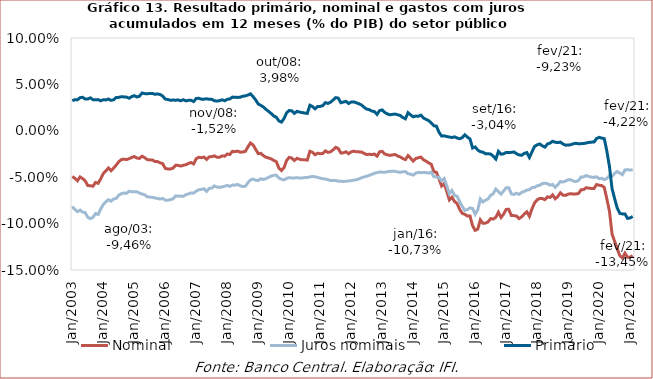
| Category | Nominal | Juros nominais | Primário |
|---|---|---|---|
| 2003-01-01 | -0.049 | -0.082 | 0.032 |
| 2003-02-01 | -0.051 | -0.085 | 0.034 |
| 2003-03-01 | -0.054 | -0.087 | 0.033 |
| 2003-04-01 | -0.05 | -0.085 | 0.036 |
| 2003-05-01 | -0.051 | -0.088 | 0.036 |
| 2003-06-01 | -0.054 | -0.088 | 0.034 |
| 2003-07-01 | -0.059 | -0.093 | 0.034 |
| 2003-08-01 | -0.059 | -0.095 | 0.036 |
| 2003-09-01 | -0.06 | -0.093 | 0.034 |
| 2003-10-01 | -0.056 | -0.089 | 0.033 |
| 2003-11-01 | -0.057 | -0.09 | 0.034 |
| 2003-12-01 | -0.052 | -0.084 | 0.032 |
| 2004-01-01 | -0.046 | -0.079 | 0.033 |
| 2004-02-01 | -0.043 | -0.076 | 0.033 |
| 2004-03-01 | -0.04 | -0.074 | 0.034 |
| 2004-04-01 | -0.043 | -0.076 | 0.033 |
| 2004-05-01 | -0.04 | -0.073 | 0.033 |
| 2004-06-01 | -0.037 | -0.073 | 0.036 |
| 2004-07-01 | -0.033 | -0.069 | 0.036 |
| 2004-08-01 | -0.031 | -0.068 | 0.037 |
| 2004-09-01 | -0.031 | -0.067 | 0.036 |
| 2004-10-01 | -0.031 | -0.067 | 0.036 |
| 2004-11-01 | -0.03 | -0.065 | 0.035 |
| 2004-12-01 | -0.029 | -0.066 | 0.037 |
| 2005-01-01 | -0.028 | -0.066 | 0.038 |
| 2005-02-01 | -0.029 | -0.066 | 0.036 |
| 2005-03-01 | -0.03 | -0.067 | 0.037 |
| 2005-04-01 | -0.027 | -0.068 | 0.041 |
| 2005-05-01 | -0.029 | -0.069 | 0.04 |
| 2005-06-01 | -0.031 | -0.071 | 0.04 |
| 2005-07-01 | -0.031 | -0.072 | 0.04 |
| 2005-08-01 | -0.031 | -0.072 | 0.04 |
| 2005-09-01 | -0.033 | -0.072 | 0.039 |
| 2005-10-01 | -0.033 | -0.073 | 0.04 |
| 2005-11-01 | -0.034 | -0.074 | 0.039 |
| 2005-12-01 | -0.035 | -0.073 | 0.037 |
| 2006-01-01 | -0.041 | -0.075 | 0.034 |
| 2006-02-01 | -0.041 | -0.075 | 0.034 |
| 2006-03-01 | -0.041 | -0.074 | 0.033 |
| 2006-04-01 | -0.04 | -0.073 | 0.033 |
| 2006-05-01 | -0.037 | -0.07 | 0.033 |
| 2006-06-01 | -0.037 | -0.07 | 0.033 |
| 2006-07-01 | -0.038 | -0.07 | 0.032 |
| 2006-08-01 | -0.037 | -0.071 | 0.034 |
| 2006-09-01 | -0.037 | -0.069 | 0.032 |
| 2006-10-01 | -0.035 | -0.068 | 0.033 |
| 2006-11-01 | -0.034 | -0.067 | 0.033 |
| 2006-12-01 | -0.036 | -0.067 | 0.032 |
| 2007-01-01 | -0.03 | -0.065 | 0.035 |
| 2007-02-01 | -0.028 | -0.063 | 0.035 |
| 2007-03-01 | -0.029 | -0.063 | 0.034 |
| 2007-04-01 | -0.028 | -0.062 | 0.034 |
| 2007-05-01 | -0.031 | -0.065 | 0.035 |
| 2007-06-01 | -0.028 | -0.062 | 0.034 |
| 2007-07-01 | -0.028 | -0.062 | 0.034 |
| 2007-08-01 | -0.027 | -0.059 | 0.032 |
| 2007-09-01 | -0.028 | -0.061 | 0.032 |
| 2007-10-01 | -0.029 | -0.061 | 0.032 |
| 2007-11-01 | -0.027 | -0.06 | 0.033 |
| 2007-12-01 | -0.027 | -0.06 | 0.032 |
| 2008-01-01 | -0.025 | -0.059 | 0.034 |
| 2008-02-01 | -0.026 | -0.06 | 0.034 |
| 2008-03-01 | -0.022 | -0.058 | 0.036 |
| 2008-04-01 | -0.022 | -0.059 | 0.036 |
| 2008-05-01 | -0.022 | -0.058 | 0.036 |
| 2008-06-01 | -0.023 | -0.059 | 0.036 |
| 2008-07-01 | -0.023 | -0.06 | 0.037 |
| 2008-08-01 | -0.022 | -0.06 | 0.038 |
| 2008-09-01 | -0.017 | -0.056 | 0.039 |
| 2008-10-01 | -0.013 | -0.053 | 0.04 |
| 2008-11-01 | -0.015 | -0.052 | 0.037 |
| 2008-12-01 | -0.02 | -0.053 | 0.033 |
| 2009-01-01 | -0.025 | -0.054 | 0.029 |
| 2009-02-01 | -0.024 | -0.052 | 0.027 |
| 2009-03-01 | -0.027 | -0.052 | 0.026 |
| 2009-04-01 | -0.029 | -0.052 | 0.023 |
| 2009-05-01 | -0.029 | -0.05 | 0.021 |
| 2009-06-01 | -0.03 | -0.049 | 0.019 |
| 2009-07-01 | -0.032 | -0.048 | 0.016 |
| 2009-08-01 | -0.033 | -0.048 | 0.015 |
| 2009-09-01 | -0.04 | -0.051 | 0.011 |
| 2009-10-01 | -0.043 | -0.052 | 0.009 |
| 2009-11-01 | -0.04 | -0.053 | 0.013 |
| 2009-12-01 | -0.032 | -0.051 | 0.019 |
| 2010-01-01 | -0.029 | -0.05 | 0.022 |
| 2010-02-01 | -0.029 | -0.051 | 0.022 |
| 2010-03-01 | -0.032 | -0.051 | 0.019 |
| 2010-04-01 | -0.03 | -0.051 | 0.021 |
| 2010-05-01 | -0.031 | -0.051 | 0.02 |
| 2010-06-01 | -0.031 | -0.051 | 0.02 |
| 2010-07-01 | -0.031 | -0.05 | 0.019 |
| 2010-08-01 | -0.032 | -0.05 | 0.019 |
| 2010-09-01 | -0.022 | -0.05 | 0.028 |
| 2010-10-01 | -0.023 | -0.049 | 0.026 |
| 2010-11-01 | -0.026 | -0.049 | 0.024 |
| 2010-12-01 | -0.024 | -0.05 | 0.026 |
| 2011-01-01 | -0.025 | -0.051 | 0.026 |
| 2011-02-01 | -0.024 | -0.052 | 0.027 |
| 2011-03-01 | -0.022 | -0.052 | 0.03 |
| 2011-04-01 | -0.023 | -0.053 | 0.029 |
| 2011-05-01 | -0.023 | -0.053 | 0.031 |
| 2011-06-01 | -0.02 | -0.054 | 0.033 |
| 2011-07-01 | -0.018 | -0.054 | 0.036 |
| 2011-08-01 | -0.019 | -0.054 | 0.035 |
| 2011-09-01 | -0.024 | -0.054 | 0.03 |
| 2011-10-01 | -0.024 | -0.055 | 0.031 |
| 2011-11-01 | -0.023 | -0.054 | 0.032 |
| 2011-12-01 | -0.025 | -0.054 | 0.029 |
| 2012-01-01 | -0.023 | -0.054 | 0.031 |
| 2012-02-01 | -0.022 | -0.053 | 0.031 |
| 2012-03-01 | -0.023 | -0.053 | 0.03 |
| 2012-04-01 | -0.023 | -0.052 | 0.029 |
| 2012-05-01 | -0.023 | -0.051 | 0.028 |
| 2012-06-01 | -0.024 | -0.05 | 0.025 |
| 2012-07-01 | -0.026 | -0.049 | 0.023 |
| 2012-08-01 | -0.025 | -0.048 | 0.023 |
| 2012-09-01 | -0.026 | -0.047 | 0.021 |
| 2012-10-01 | -0.025 | -0.046 | 0.021 |
| 2012-11-01 | -0.027 | -0.045 | 0.018 |
| 2012-12-01 | -0.023 | -0.044 | 0.022 |
| 2013-01-01 | -0.022 | -0.045 | 0.022 |
| 2013-02-01 | -0.025 | -0.045 | 0.02 |
| 2013-03-01 | -0.026 | -0.044 | 0.018 |
| 2013-04-01 | -0.027 | -0.044 | 0.017 |
| 2013-05-01 | -0.026 | -0.044 | 0.018 |
| 2013-06-01 | -0.026 | -0.044 | 0.018 |
| 2013-07-01 | -0.027 | -0.044 | 0.017 |
| 2013-08-01 | -0.028 | -0.045 | 0.016 |
| 2013-09-01 | -0.03 | -0.044 | 0.014 |
| 2013-10-01 | -0.031 | -0.044 | 0.013 |
| 2013-11-01 | -0.027 | -0.046 | 0.02 |
| 2013-12-01 | -0.03 | -0.047 | 0.017 |
| 2014-01-01 | -0.033 | -0.048 | 0.015 |
| 2014-02-01 | -0.03 | -0.046 | 0.016 |
| 2014-03-01 | -0.029 | -0.045 | 0.016 |
| 2014-04-01 | -0.028 | -0.045 | 0.017 |
| 2014-05-01 | -0.031 | -0.045 | 0.014 |
| 2014-06-01 | -0.033 | -0.045 | 0.012 |
| 2014-07-01 | -0.035 | -0.046 | 0.011 |
| 2014-08-01 | -0.036 | -0.044 | 0.008 |
| 2014-09-01 | -0.044 | -0.049 | 0.005 |
| 2014-10-01 | -0.045 | -0.05 | 0.005 |
| 2014-11-01 | -0.052 | -0.05 | -0.002 |
| 2014-12-01 | -0.06 | -0.054 | -0.006 |
| 2015-01-01 | -0.057 | -0.052 | -0.005 |
| 2015-02-01 | -0.065 | -0.059 | -0.006 |
| 2015-03-01 | -0.074 | -0.068 | -0.007 |
| 2015-04-01 | -0.072 | -0.064 | -0.007 |
| 2015-05-01 | -0.076 | -0.07 | -0.007 |
| 2015-06-01 | -0.078 | -0.071 | -0.008 |
| 2015-07-01 | -0.085 | -0.076 | -0.009 |
| 2015-08-01 | -0.089 | -0.082 | -0.007 |
| 2015-09-01 | -0.09 | -0.086 | -0.004 |
| 2015-10-01 | -0.092 | -0.085 | -0.007 |
| 2015-11-01 | -0.092 | -0.083 | -0.009 |
| 2015-12-01 | -0.102 | -0.084 | -0.019 |
| 2016-01-01 | -0.107 | -0.09 | -0.017 |
| 2016-02-01 | -0.106 | -0.085 | -0.021 |
| 2016-03-01 | -0.096 | -0.073 | -0.023 |
| 2016-04-01 | -0.1 | -0.077 | -0.023 |
| 2016-05-01 | -0.099 | -0.075 | -0.025 |
| 2016-06-01 | -0.098 | -0.073 | -0.025 |
| 2016-07-01 | -0.095 | -0.07 | -0.025 |
| 2016-08-01 | -0.095 | -0.068 | -0.027 |
| 2016-09-01 | -0.093 | -0.063 | -0.03 |
| 2016-10-01 | -0.088 | -0.066 | -0.022 |
| 2016-11-01 | -0.093 | -0.068 | -0.025 |
| 2016-12-01 | -0.09 | -0.065 | -0.025 |
| 2017-01-01 | -0.085 | -0.061 | -0.023 |
| 2017-02-01 | -0.085 | -0.061 | -0.023 |
| 2017-03-01 | -0.091 | -0.068 | -0.023 |
| 2017-04-01 | -0.091 | -0.069 | -0.023 |
| 2017-05-01 | -0.092 | -0.067 | -0.025 |
| 2017-06-01 | -0.095 | -0.069 | -0.026 |
| 2017-07-01 | -0.093 | -0.066 | -0.026 |
| 2017-08-01 | -0.09 | -0.065 | -0.024 |
| 2017-09-01 | -0.087 | -0.064 | -0.023 |
| 2017-10-01 | -0.092 | -0.063 | -0.029 |
| 2017-11-01 | -0.084 | -0.061 | -0.023 |
| 2017-12-01 | -0.078 | -0.061 | -0.017 |
| 2018-01-01 | -0.074 | -0.059 | -0.015 |
| 2018-02-01 | -0.073 | -0.059 | -0.014 |
| 2018-03-01 | -0.073 | -0.057 | -0.016 |
| 2018-04-01 | -0.074 | -0.057 | -0.018 |
| 2018-05-01 | -0.071 | -0.057 | -0.014 |
| 2018-06-01 | -0.072 | -0.059 | -0.013 |
| 2018-07-01 | -0.069 | -0.058 | -0.011 |
| 2018-08-01 | -0.073 | -0.061 | -0.012 |
| 2018-09-01 | -0.071 | -0.058 | -0.013 |
| 2018-10-01 | -0.067 | -0.055 | -0.012 |
| 2018-11-01 | -0.069 | -0.055 | -0.014 |
| 2018-12-01 | -0.07 | -0.054 | -0.015 |
| 2019-01-01 | -0.068 | -0.053 | -0.015 |
| 2019-02-01 | -0.068 | -0.053 | -0.015 |
| 2019-03-01 | -0.068 | -0.054 | -0.014 |
| 2019-04-01 | -0.068 | -0.055 | -0.013 |
| 2019-05-01 | -0.068 | -0.054 | -0.014 |
| 2019-06-01 | -0.064 | -0.05 | -0.014 |
| 2019-07-01 | -0.063 | -0.05 | -0.014 |
| 2019-08-01 | -0.061 | -0.048 | -0.013 |
| 2019-09-01 | -0.062 | -0.049 | -0.013 |
| 2019-10-01 | -0.062 | -0.05 | -0.012 |
| 2019-11-01 | -0.062 | -0.05 | -0.012 |
| 2019-12-01 | -0.058 | -0.05 | -0.008 |
| 2020-01-01 | -0.059 | -0.052 | -0.007 |
| 2020-02-01 | -0.059 | -0.051 | -0.008 |
| 2020-03-01 | -0.061 | -0.053 | -0.008 |
| 2020-04-01 | -0.074 | -0.051 | -0.022 |
| 2020-05-01 | -0.087 | -0.048 | -0.038 |
| 2020-06-01 | -0.111 | -0.049 | -0.062 |
| 2020-07-01 | -0.119 | -0.046 | -0.073 |
| 2020-08-01 | -0.127 | -0.044 | -0.083 |
| 2020-09-01 | -0.135 | -0.046 | -0.089 |
| 2020-10-01 | -0.137 | -0.047 | -0.09 |
| 2020-11-01 | -0.132 | -0.042 | -0.09 |
| 2020-12-01 | -0.136 | -0.042 | -0.094 |
| 2021-01-01 | -0.136 | -0.042 | -0.094 |
| 2021-02-01 | -0.134 | -0.042 | -0.092 |